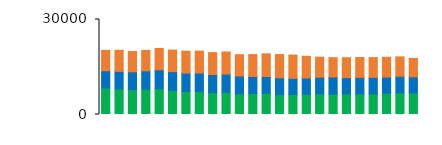
| Category | East |
|---|---|
| 0 | 6439 |
| 1 | 6652 |
| 2 | 6407 |
| 3 | 6467 |
| 4 | 6728 |
| 5 | 6824 |
| 6 | 6912 |
| 7 | 6913 |
| 8 | 6914 |
| 9 | 6994 |
| 10 | 6731 |
| 11 | 6916 |
| 12 | 7157 |
| 13 | 7315 |
| 14 | 7350 |
| 15 | 6854 |
| 16 | 6314 |
| 17 | 6099 |
| 18 | 6279 |
| 19 | 6275 |
| 20 | 6230 |
| 21 | 6232 |
| 22 | 6152 |
| 23 | 5790 |